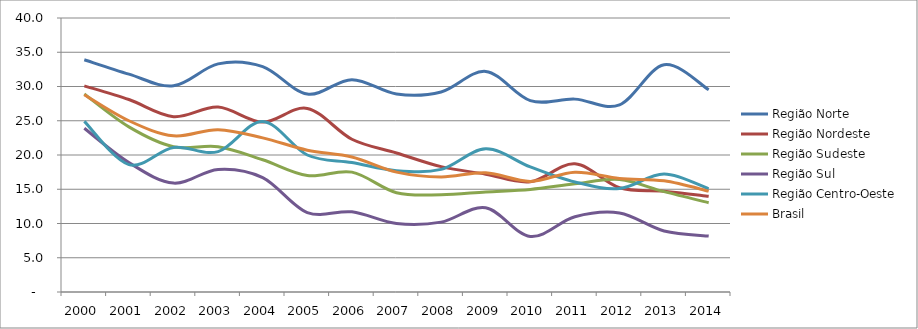
| Category | Região Norte | Região Nordeste | Região Sudeste | Região Sul | Região Centro-Oeste | Brasil |
|---|---|---|---|---|---|---|
| 2000.0 | 33.9 | 30.1 | 28.9 | 23.9 | 24.9 | 28.8 |
| 2001.0 | 31.8 | 28.1 | 24.1 | 18.9 | 18.6 | 25 |
| 2002.0 | 30.1 | 25.6 | 21.2 | 15.9 | 21.1 | 22.8 |
| 2003.0 | 33.3 | 27 | 21.2 | 17.9 | 20.5 | 23.7 |
| 2004.0 | 32.9 | 24.8 | 19.3 | 16.7 | 24.9 | 22.5 |
| 2005.0 | 28.9 | 26.8 | 17 | 11.6 | 20 | 20.7 |
| 2006.0 | 31 | 22.3 | 17.5 | 11.7 | 18.9 | 19.7 |
| 2007.0 | 28.9 | 20.3 | 14.5 | 10 | 17.7 | 17.5 |
| 2008.0 | 29.2 | 18.3 | 14.2 | 10.2 | 17.9 | 16.8 |
| 2009.0 | 32.2 | 17.2 | 14.6 | 12.3 | 20.9 | 17.4 |
| 2010.0 | 27.936 | 16.092 | 14.968 | 8.108 | 18.256 | 16.149 |
| 2011.0 | 28.157 | 18.705 | 15.79 | 10.982 | 16.059 | 17.492 |
| 2012.0 | 27.325 | 15.211 | 16.414 | 11.528 | 15.12 | 16.569 |
| 2013.0 | 33.183 | 14.725 | 14.647 | 8.909 | 17.227 | 16.228 |
| 2014.0 | 29.532 | 13.962 | 13.039 | 8.162 | 15.062 | 14.721 |